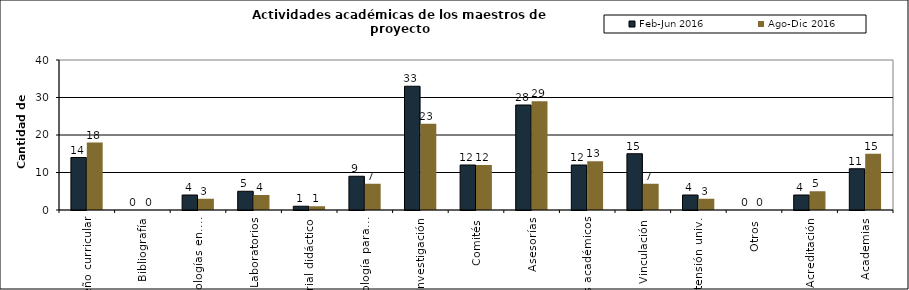
| Category | Feb-Jun 2016 | Ago-Dic 2016 |
|---|---|---|
| Diseño curricular | 14 | 18 |
| Bibliografía | 0 | 0 |
| Metodologías en.... | 4 | 3 |
| Laboratorios | 5 | 4 |
| Material didáctico | 1 | 1 |
| Metodología para... | 9 | 7 |
| Investigación | 33 | 23 |
| Comités | 12 | 12 |
| Asesorías | 28 | 29 |
| Clubs académicos | 12 | 13 |
| Vinculación | 15 | 7 |
| Extensión univ. | 4 | 3 |
| Otros | 0 | 0 |
| Acreditación | 4 | 5 |
| Academias | 11 | 15 |